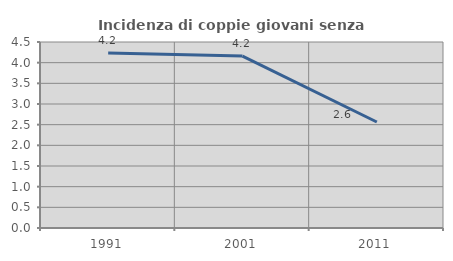
| Category | Incidenza di coppie giovani senza figli |
|---|---|
| 1991.0 | 4.231 |
| 2001.0 | 4.16 |
| 2011.0 | 2.565 |